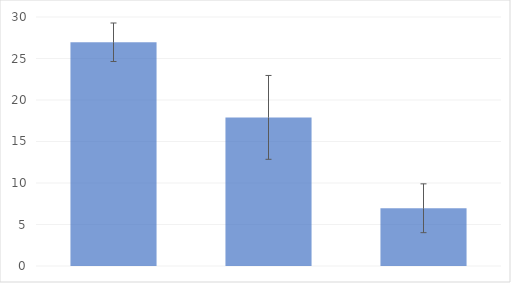
| Category | Series 0 |
|---|---|
| 0 | 26.957 |
| 1 | 17.906 |
| 2 | 6.957 |